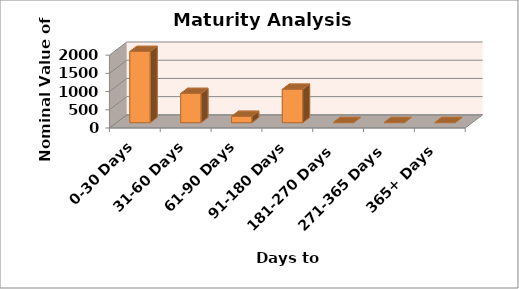
| Category | Nominal |
|---|---|
| 0-30 Days | 1953000000 |
| 31-60 Days | 800000000 |
| 61-90 Days | 171000000 |
| 91-180 Days | 915000000 |
| 181-270 Days | 0 |
| 271-365 Days | 0 |
| 365+ Days | 0 |